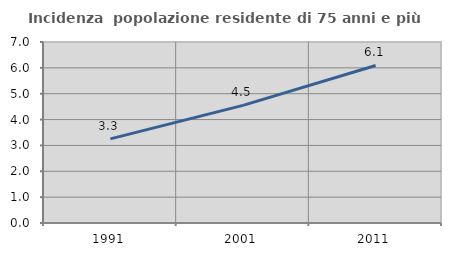
| Category | Incidenza  popolazione residente di 75 anni e più |
|---|---|
| 1991.0 | 3.254 |
| 2001.0 | 4.547 |
| 2011.0 | 6.092 |